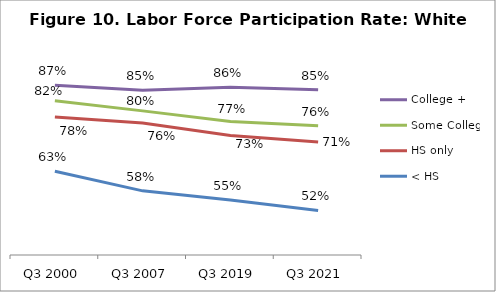
| Category | College + | Some College | HS only | < HS |
|---|---|---|---|---|
| Q3 2000 | 0.867 | 0.824 | 0.78 | 0.631 |
| Q3 2007 | 0.854 | 0.797 | 0.763 | 0.577 |
| Q3 2019 | 0.862 | 0.767 | 0.729 | 0.552 |
| Q3 2021 | 0.855 | 0.756 | 0.711 | 0.523 |